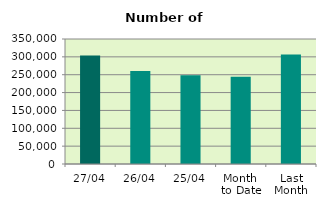
| Category | Series 0 |
|---|---|
| 27/04 | 303566 |
| 26/04 | 260084 |
| 25/04 | 248424 |
| Month 
to Date | 244549.5 |
| Last
Month | 306734.174 |